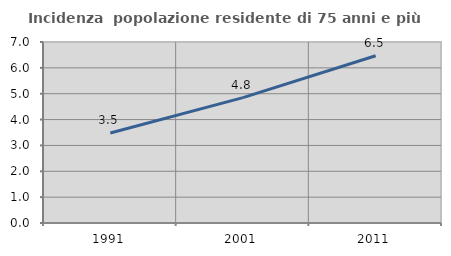
| Category | Incidenza  popolazione residente di 75 anni e più |
|---|---|
| 1991.0 | 3.478 |
| 2001.0 | 4.849 |
| 2011.0 | 6.47 |